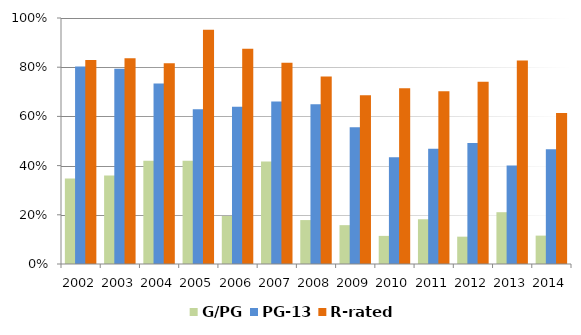
| Category | G/PG | PG-13 | R-rated |
|---|---|---|---|
| 2002.0 | 0.348 | 0.803 | 0.829 |
| 2003.0 | 0.36 | 0.794 | 0.837 |
| 2004.0 | 0.419 | 0.733 | 0.816 |
| 2005.0 | 0.419 | 0.629 | 0.952 |
| 2006.0 | 0.195 | 0.639 | 0.875 |
| 2007.0 | 0.417 | 0.661 | 0.818 |
| 2008.0 | 0.179 | 0.649 | 0.762 |
| 2009.0 | 0.158 | 0.556 | 0.686 |
| 2010.0 | 0.114 | 0.434 | 0.714 |
| 2011.0 | 0.182 | 0.469 | 0.703 |
| 2012.0 | 0.111 | 0.492 | 0.741 |
| 2013.0 | 0.211 | 0.4 | 0.828 |
| 2014.0 | 0.115 | 0.467 | 0.614 |